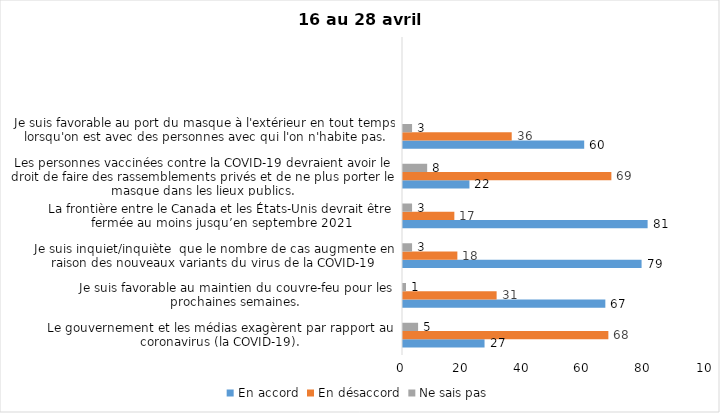
| Category | En accord | En désaccord | Ne sais pas |
|---|---|---|---|
| Le gouvernement et les médias exagèrent par rapport au coronavirus (la COVID-19). | 27 | 68 | 5 |
| Je suis favorable au maintien du couvre-feu pour les prochaines semaines. | 67 | 31 | 1 |
| Je suis inquiet/inquiète  que le nombre de cas augmente en raison des nouveaux variants du virus de la COVID-19 | 79 | 18 | 3 |
| La frontière entre le Canada et les États-Unis devrait être fermée au moins jusqu’en septembre 2021 | 81 | 17 | 3 |
| Les personnes vaccinées contre la COVID-19 devraient avoir le droit de faire des rassemblements privés et de ne plus porter le masque dans les lieux publics. | 22 | 69 | 8 |
| Je suis favorable au port du masque à l'extérieur en tout temps lorsqu'on est avec des personnes avec qui l'on n'habite pas. | 60 | 36 | 3 |